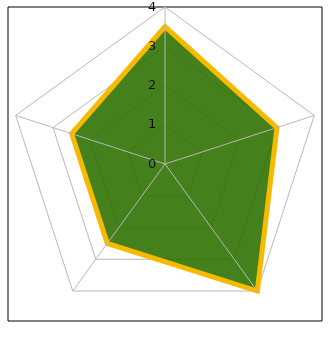
| Category | Sans titre 1 |
|---|---|
| 0 | 3.5 |
| 1 | 3 |
| 2 | 4 |
| 3 | 2.5 |
| 4 | 2.5 |